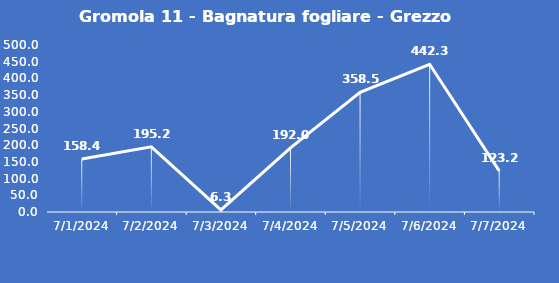
| Category | Gromola 11 - Bagnatura fogliare - Grezzo (min) |
|---|---|
| 7/1/24 | 158.4 |
| 7/2/24 | 195.2 |
| 7/3/24 | 6.3 |
| 7/4/24 | 192 |
| 7/5/24 | 358.5 |
| 7/6/24 | 442.3 |
| 7/7/24 | 123.2 |